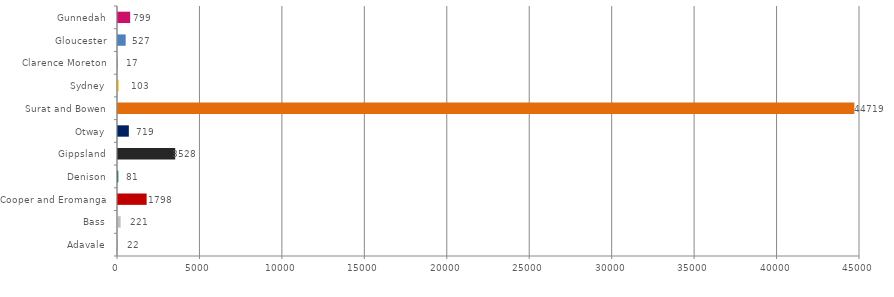
| Category | Series 0 |
|---|---|
| Adavale | 21.53 |
| Bass | 221.176 |
| Cooper and Eromanga | 1797.804 |
| Denison | 80.857 |
| Gippsland | 3528.434 |
| Otway | 719 |
| Surat and Bowen | 44719.3 |
| Sydney | 103 |
| Clarence Moreton | 17 |
| Gloucester | 527 |
| Gunnedah | 798.7 |